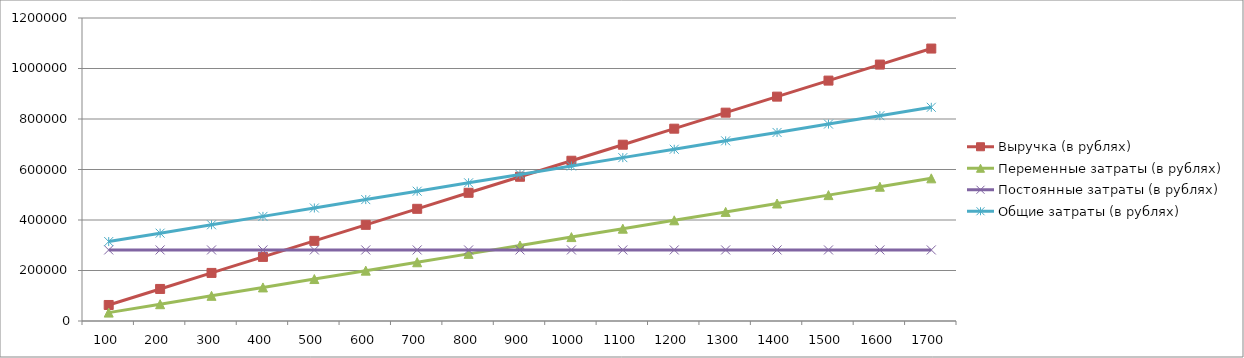
| Category | Выручка (в рублях) | Переменные затраты (в рублях) | Постоянные затраты (в рублях) | Общие затраты (в рублях) |
|---|---|---|---|---|
| 100.0 | 63470.588 | 33235.294 | 281400 | 314635.294 |
| 200.0 | 126941.176 | 66470.588 | 281400 | 347870.588 |
| 300.0 | 190411.765 | 99705.882 | 281400 | 381105.882 |
| 400.0 | 253882.353 | 132941.176 | 281400 | 414341.176 |
| 500.0 | 317352.941 | 166176.471 | 281400 | 447576.471 |
| 600.0 | 380823.529 | 199411.765 | 281400 | 480811.765 |
| 700.0 | 444294.118 | 232647.059 | 281400 | 514047.059 |
| 800.0 | 507764.706 | 265882.353 | 281400 | 547282.353 |
| 900.0 | 571235.294 | 299117.647 | 281400 | 580517.647 |
| 1000.0 | 634705.882 | 332352.941 | 281400 | 613752.941 |
| 1100.0 | 698176.471 | 365588.235 | 281400 | 646988.235 |
| 1200.0 | 761647.059 | 398823.529 | 281400 | 680223.529 |
| 1300.0 | 825117.647 | 432058.824 | 281400 | 713458.824 |
| 1400.0 | 888588.235 | 465294.118 | 281400 | 746694.118 |
| 1500.0 | 952058.824 | 498529.412 | 281400 | 779929.412 |
| 1600.0 | 1015529.412 | 531764.706 | 281400 | 813164.706 |
| 1700.0 | 1079000 | 565000 | 281400 | 846400 |